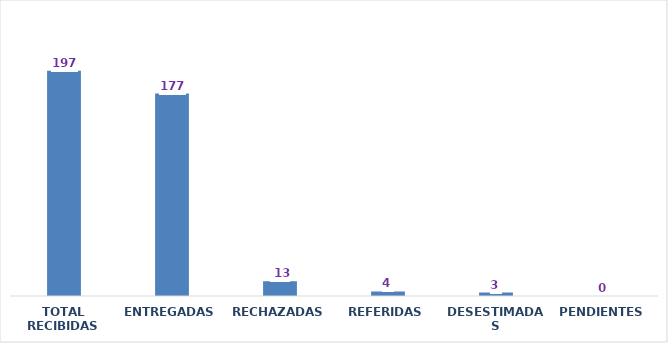
| Category | Series 0 |
|---|---|
| TOTAL RECIBIDAS | 197 |
| ENTREGADAS | 177 |
| RECHAZADAS | 13 |
| REFERIDAS | 4 |
| DESESTIMADAS | 3 |
| PENDIENTES | 0 |